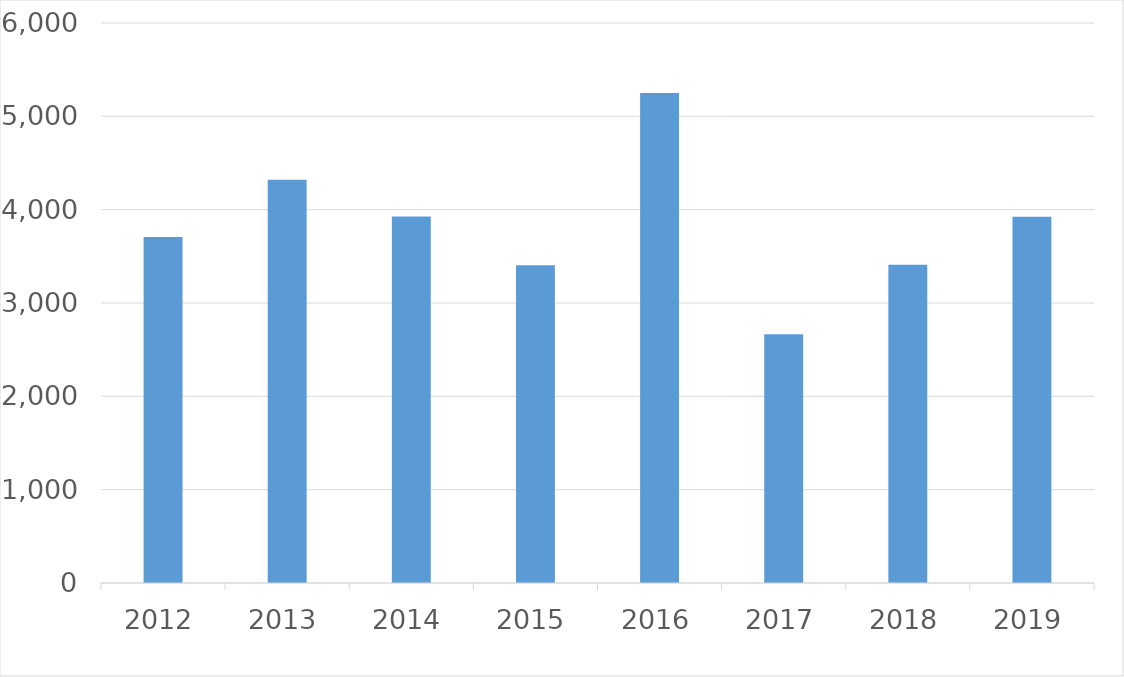
| Category | Series 0 |
|---|---|
| 2012 | 3706 |
| 2013 | 4321 |
| 2014 | 3928 |
| 2015 | 3405 |
| 2016 | 5249 |
| 2017 | 2664 |
| 2018 | 3410 |
| 2019 | 3923 |